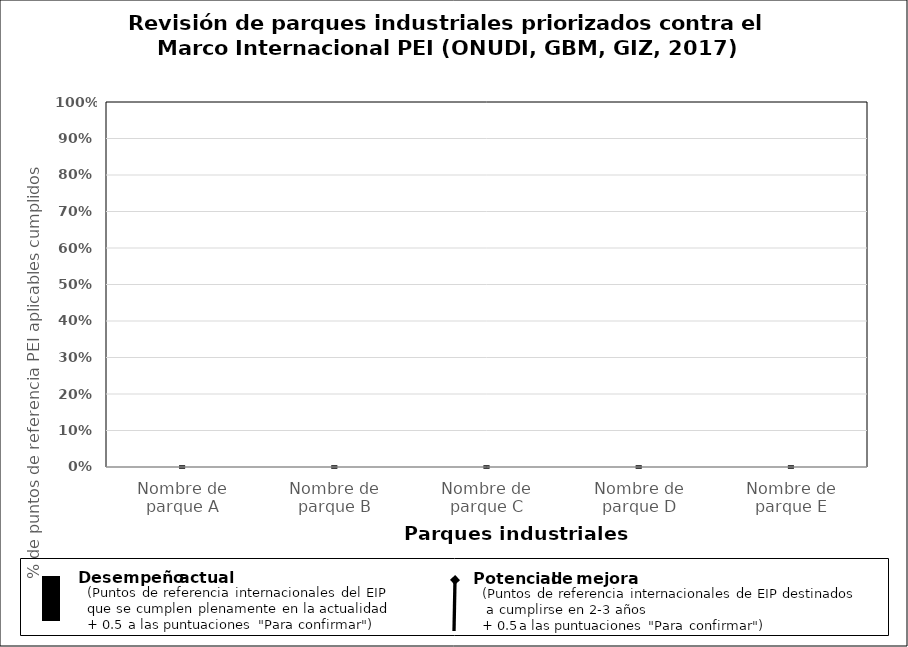
| Category | Actuación actual |
|---|---|
| Nombre de parque A | 0 |
| Nombre de parque B | 0 |
| Nombre de parque C | 0 |
| Nombre de parque D | 0 |
| Nombre de parque E | 0 |